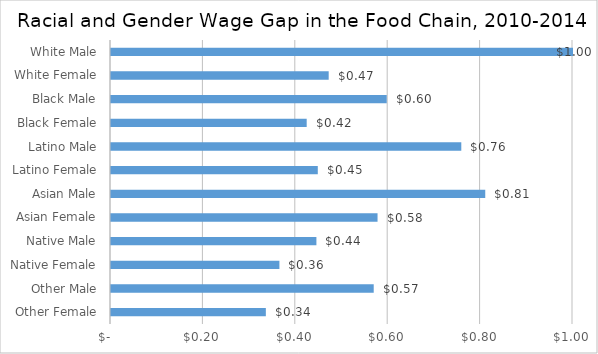
| Category | Series 0 |
|---|---|
| Other Female | 0.335 |
| Other Male | 0.569 |
| Native Female | 0.365 |
| Native Male | 0.445 |
| Asian Female | 0.577 |
| Asian Male | 0.81 |
| Latino Female | 0.448 |
| Latino Male | 0.758 |
| Black Female | 0.424 |
| Black Male | 0.597 |
| White Female | 0.471 |
| White Male | 1 |